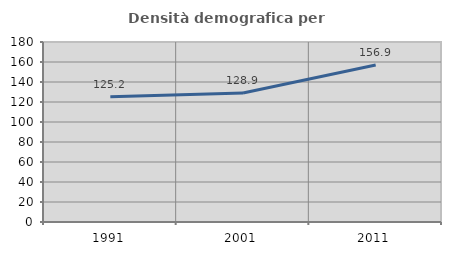
| Category | Densità demografica |
|---|---|
| 1991.0 | 125.228 |
| 2001.0 | 128.921 |
| 2011.0 | 156.944 |